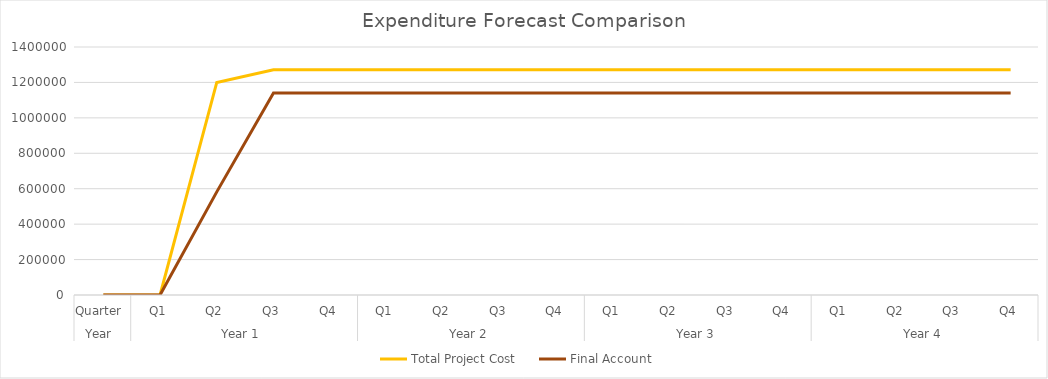
| Category | Total Project Cost | Final Account |
|---|---|---|
| 0 | 0 | 0 |
| 1 | 0 | 0 |
| 2 | 1200000 | 582250 |
| 3 | 1271703.54 | 1140576.25 |
| 4 | 1271703.54 | 1140576.25 |
| 5 | 1271703.54 | 1140576.25 |
| 6 | 1271703.54 | 1140576.25 |
| 7 | 1271703.54 | 1140576.25 |
| 8 | 1271703.54 | 1140576.25 |
| 9 | 1271703.54 | 1140576.25 |
| 10 | 1271703.54 | 1140576.25 |
| 11 | 1271703.54 | 1140576.25 |
| 12 | 1271703.54 | 1140576.25 |
| 13 | 1271703.54 | 1140576.25 |
| 14 | 1271703.54 | 1140576.25 |
| 15 | 1271703.54 | 1140576.25 |
| 16 | 1271703.54 | 1140576.25 |